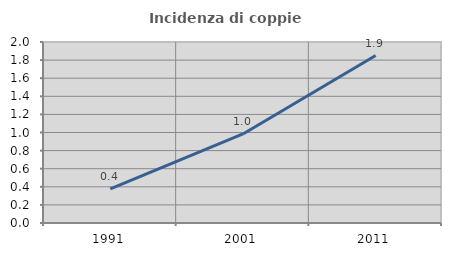
| Category | Incidenza di coppie miste |
|---|---|
| 1991.0 | 0.376 |
| 2001.0 | 0.984 |
| 2011.0 | 1.85 |